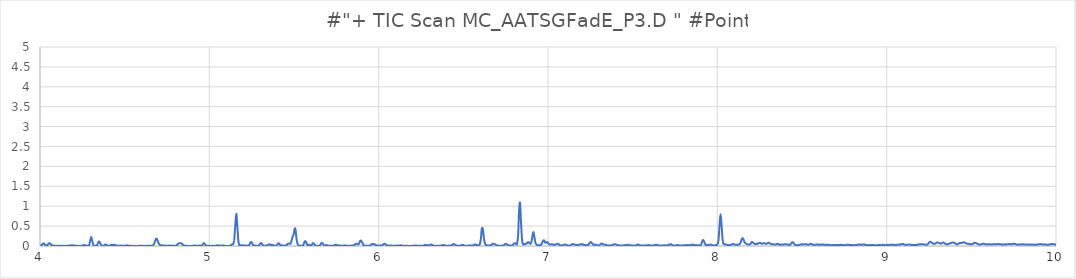
| Category | Series 0 |
|---|---|
| 3.393 | 0.011 |
| 3.399 | 0.013 |
| 3.405 | 0.021 |
| 3.411 | 0.059 |
| 3.416 | 0.067 |
| 3.422 | 0.036 |
| 3.428 | 0.018 |
| 3.434 | 0.018 |
| 3.44 | 0.01 |
| 3.446 | 0.005 |
| 3.452 | 0.004 |
| 3.458 | 0.003 |
| 3.464 | 0.005 |
| 3.47 | 0.005 |
| 3.476 | 0.008 |
| 3.482 | 0.01 |
| 3.488 | 0.01 |
| 3.494 | 0.007 |
| 3.5 | 0.006 |
| 3.506 | 0.006 |
| 3.512 | 0.01 |
| 3.518 | 0.007 |
| 3.524 | 0.008 |
| 3.529 | 0.006 |
| 3.535 | 0.007 |
| 3.541 | 0.004 |
| 3.547 | 0.006 |
| 3.553 | 0.004 |
| 3.559 | 0.009 |
| 3.565 | 0.006 |
| 3.571 | 0.005 |
| 3.577 | 0.002 |
| 3.583 | 0.005 |
| 3.589 | 0.007 |
| 3.595 | 0.007 |
| 3.601 | 0.004 |
| 3.607 | 0.007 |
| 3.613 | 0.006 |
| 3.619 | 0.013 |
| 3.625 | 0.032 |
| 3.631 | 0.049 |
| 3.636 | 0.143 |
| 3.642 | 0.401 |
| 3.648 | 0.504 |
| 3.654 | 0.333 |
| 3.66 | 0.154 |
| 3.666 | 0.046 |
| 3.672 | 0.014 |
| 3.678 | 0.01 |
| 3.684 | 0.014 |
| 3.69 | 0.047 |
| 3.696 | 0.091 |
| 3.702 | 0.074 |
| 3.708 | 0.029 |
| 3.714 | 0.033 |
| 3.72 | 0.135 |
| 3.726 | 0.275 |
| 3.732 | 0.215 |
| 3.738 | 0.069 |
| 3.744 | 0.017 |
| 3.749 | 0.01 |
| 3.755 | 0.008 |
| 3.761 | 0.01 |
| 3.767 | 0.015 |
| 3.773 | 0.016 |
| 3.779 | 0.009 |
| 3.785 | 0.003 |
| 3.791 | 0.006 |
| 3.797 | 0.004 |
| 3.803 | 0.002 |
| 3.809 | 0.007 |
| 3.815 | 0.006 |
| 3.821 | 0.008 |
| 3.827 | 0.003 |
| 3.833 | 0.006 |
| 3.839 | 0.004 |
| 3.845 | 0.007 |
| 3.851 | 0.004 |
| 3.856 | 0.005 |
| 3.862 | 0.007 |
| 3.868 | 0.019 |
| 3.874 | 0.043 |
| 3.88 | 0.038 |
| 3.886 | 0.03 |
| 3.892 | 0.033 |
| 3.898 | 0.044 |
| 3.904 | 0.142 |
| 3.91 | 0.493 |
| 3.916 | 0.667 |
| 3.922 | 0.336 |
| 3.928 | 0.072 |
| 3.934 | 0.021 |
| 3.94 | 0.036 |
| 3.946 | 0.165 |
| 3.952 | 0.282 |
| 3.958 | 0.194 |
| 3.964 | 0.079 |
| 3.969 | 0.058 |
| 3.975 | 0.09 |
| 3.981 | 0.116 |
| 3.987 | 0.086 |
| 3.993 | 0.049 |
| 3.999 | 0.026 |
| 4.005 | 0.015 |
| 4.011 | 0.03 |
| 4.017 | 0.061 |
| 4.023 | 0.062 |
| 4.029 | 0.034 |
| 4.035 | 0.01 |
| 4.041 | 0.015 |
| 4.047 | 0.041 |
| 4.053 | 0.069 |
| 4.059 | 0.064 |
| 4.065 | 0.034 |
| 4.071 | 0.028 |
| 4.076 | 0.015 |
| 4.082 | 0.007 |
| 4.088 | 0.008 |
| 4.094 | 0.001 |
| 4.1 | 0.005 |
| 4.106 | 0.006 |
| 4.112 | 0.004 |
| 4.118 | 0.004 |
| 4.124 | 0.009 |
| 4.13 | 0.002 |
| 4.136 | 0.005 |
| 4.142 | 0.002 |
| 4.148 | 0.003 |
| 4.154 | 0.007 |
| 4.16 | 0.004 |
| 4.166 | 0.004 |
| 4.172 | 0.007 |
| 4.178 | 0.013 |
| 4.184 | 0.018 |
| 4.189 | 0.018 |
| 4.195 | 0.016 |
| 4.201 | 0.009 |
| 4.207 | 0.012 |
| 4.213 | 0.003 |
| 4.219 | 0.006 |
| 4.225 | 0.003 |
| 4.231 | 0.002 |
| 4.237 | 0.003 |
| 4.243 | 0.003 |
| 4.249 | 0.006 |
| 4.255 | 0.02 |
| 4.261 | 0.027 |
| 4.267 | 0.019 |
| 4.273 | 0.011 |
| 4.279 | 0.007 |
| 4.285 | 0.006 |
| 4.291 | 0.036 |
| 4.296 | 0.121 |
| 4.302 | 0.225 |
| 4.308 | 0.141 |
| 4.314 | 0.043 |
| 4.32 | 0.01 |
| 4.326 | 0.003 |
| 4.332 | 0.006 |
| 4.338 | 0.029 |
| 4.344 | 0.088 |
| 4.35 | 0.116 |
| 4.356 | 0.069 |
| 4.362 | 0.021 |
| 4.368 | 0.005 |
| 4.374 | 0.006 |
| 4.38 | 0.017 |
| 4.386 | 0.037 |
| 4.392 | 0.033 |
| 4.398 | 0.014 |
| 4.404 | 0.008 |
| 4.409 | 0.008 |
| 4.415 | 0.018 |
| 4.421 | 0.027 |
| 4.427 | 0.025 |
| 4.433 | 0.024 |
| 4.439 | 0.032 |
| 4.445 | 0.025 |
| 4.451 | 0.013 |
| 4.457 | 0.004 |
| 4.463 | 0.004 |
| 4.469 | 0.009 |
| 4.475 | 0.011 |
| 4.481 | 0.006 |
| 4.487 | 0.01 |
| 4.493 | 0.004 |
| 4.499 | 0.005 |
| 4.505 | 0.009 |
| 4.511 | 0.017 |
| 4.516 | 0.013 |
| 4.522 | 0.011 |
| 4.528 | 0.006 |
| 4.534 | 0.006 |
| 4.54 | 0.003 |
| 4.546 | 0.004 |
| 4.552 | 0.002 |
| 4.558 | 0.001 |
| 4.564 | 0.004 |
| 4.57 | 0.001 |
| 4.576 | 0.002 |
| 4.582 | 0.006 |
| 4.588 | 0.007 |
| 4.594 | 0.004 |
| 4.6 | 0.005 |
| 4.606 | 0.004 |
| 4.612 | 0.003 |
| 4.618 | 0.002 |
| 4.624 | 0.003 |
| 4.629 | 0.003 |
| 4.635 | 0.004 |
| 4.641 | 0.003 |
| 4.647 | 0.007 |
| 4.653 | 0.005 |
| 4.659 | 0.006 |
| 4.665 | 0.012 |
| 4.671 | 0.034 |
| 4.677 | 0.092 |
| 4.683 | 0.167 |
| 4.689 | 0.187 |
| 4.695 | 0.131 |
| 4.701 | 0.066 |
| 4.707 | 0.034 |
| 4.713 | 0.02 |
| 4.719 | 0.014 |
| 4.725 | 0.012 |
| 4.731 | 0.012 |
| 4.736 | 0.01 |
| 4.742 | 0.007 |
| 4.748 | 0.007 |
| 4.754 | 0.009 |
| 4.76 | 0.01 |
| 4.766 | 0.007 |
| 4.772 | 0.012 |
| 4.778 | 0.007 |
| 4.784 | 0.005 |
| 4.79 | 0.007 |
| 4.796 | 0.006 |
| 4.802 | 0.007 |
| 4.808 | 0.023 |
| 4.814 | 0.051 |
| 4.82 | 0.066 |
| 4.826 | 0.066 |
| 4.832 | 0.069 |
| 4.838 | 0.059 |
| 4.844 | 0.03 |
| 4.849 | 0.014 |
| 4.855 | 0.009 |
| 4.861 | 0.007 |
| 4.867 | 0.005 |
| 4.873 | 0 |
| 4.879 | 0.002 |
| 4.885 | 0 |
| 4.891 | 0.003 |
| 4.897 | 0 |
| 4.903 | 0.007 |
| 4.909 | 0.011 |
| 4.915 | 0.01 |
| 4.921 | 0.003 |
| 4.927 | 0.006 |
| 4.933 | 0.007 |
| 4.939 | 0.009 |
| 4.945 | 0.012 |
| 4.951 | 0.009 |
| 4.956 | 0.012 |
| 4.962 | 0.046 |
| 4.968 | 0.073 |
| 4.974 | 0.044 |
| 4.98 | 0.014 |
| 4.986 | 0.007 |
| 4.992 | 0.004 |
| 4.998 | 0.005 |
| 5.004 | 0.003 |
| 5.01 | 0.002 |
| 5.016 | 0.003 |
| 5.022 | 0.006 |
| 5.028 | 0.007 |
| 5.034 | 0.006 |
| 5.04 | 0.009 |
| 5.046 | 0.011 |
| 5.052 | 0.02 |
| 5.058 | 0.011 |
| 5.064 | 0.005 |
| 5.069 | 0.008 |
| 5.075 | 0.011 |
| 5.081 | 0.013 |
| 5.087 | 0.01 |
| 5.093 | 0.006 |
| 5.099 | 0.003 |
| 5.105 | 0.002 |
| 5.111 | 0.002 |
| 5.117 | 0.003 |
| 5.123 | 0.009 |
| 5.129 | 0.024 |
| 5.135 | 0.044 |
| 5.141 | 0.046 |
| 5.147 | 0.137 |
| 5.153 | 0.512 |
| 5.159 | 0.813 |
| 5.165 | 0.522 |
| 5.171 | 0.146 |
| 5.176 | 0.032 |
| 5.182 | 0.018 |
| 5.188 | 0.016 |
| 5.194 | 0.012 |
| 5.2 | 0.015 |
| 5.206 | 0.016 |
| 5.212 | 0.01 |
| 5.218 | 0.01 |
| 5.224 | 0.006 |
| 5.23 | 0.007 |
| 5.236 | 0.031 |
| 5.242 | 0.082 |
| 5.248 | 0.099 |
| 5.254 | 0.057 |
| 5.26 | 0.017 |
| 5.266 | 0.014 |
| 5.272 | 0.01 |
| 5.278 | 0.006 |
| 5.284 | 0.005 |
| 5.289 | 0.006 |
| 5.295 | 0.025 |
| 5.301 | 0.06 |
| 5.307 | 0.076 |
| 5.313 | 0.04 |
| 5.319 | 0.011 |
| 5.325 | 0.008 |
| 5.331 | 0.009 |
| 5.337 | 0.01 |
| 5.343 | 0.02 |
| 5.349 | 0.033 |
| 5.355 | 0.043 |
| 5.361 | 0.03 |
| 5.367 | 0.022 |
| 5.373 | 0.026 |
| 5.379 | 0.017 |
| 5.385 | 0.009 |
| 5.391 | 0.007 |
| 5.396 | 0.014 |
| 5.402 | 0.043 |
| 5.408 | 0.07 |
| 5.414 | 0.052 |
| 5.42 | 0.021 |
| 5.426 | 0.015 |
| 5.432 | 0.015 |
| 5.438 | 0.012 |
| 5.444 | 0.009 |
| 5.45 | 0.009 |
| 5.456 | 0.023 |
| 5.462 | 0.049 |
| 5.468 | 0.064 |
| 5.474 | 0.056 |
| 5.48 | 0.062 |
| 5.486 | 0.145 |
| 5.492 | 0.234 |
| 5.498 | 0.291 |
| 5.504 | 0.434 |
| 5.509 | 0.409 |
| 5.515 | 0.181 |
| 5.521 | 0.056 |
| 5.527 | 0.016 |
| 5.533 | 0.008 |
| 5.539 | 0.005 |
| 5.545 | 0.005 |
| 5.551 | 0.01 |
| 5.557 | 0.043 |
| 5.563 | 0.112 |
| 5.569 | 0.117 |
| 5.575 | 0.059 |
| 5.581 | 0.021 |
| 5.587 | 0.03 |
| 5.593 | 0.024 |
| 5.599 | 0.019 |
| 5.605 | 0.029 |
| 5.611 | 0.067 |
| 5.616 | 0.066 |
| 5.622 | 0.035 |
| 5.628 | 0.009 |
| 5.634 | 0.003 |
| 5.64 | 0.003 |
| 5.646 | 0.003 |
| 5.652 | 0.016 |
| 5.658 | 0.046 |
| 5.664 | 0.08 |
| 5.67 | 0.064 |
| 5.676 | 0.023 |
| 5.682 | 0.013 |
| 5.688 | 0.019 |
| 5.694 | 0.023 |
| 5.7 | 0.01 |
| 5.706 | 0.006 |
| 5.712 | 0.006 |
| 5.718 | 0.003 |
| 5.724 | 0.004 |
| 5.729 | 0.008 |
| 5.735 | 0.006 |
| 5.741 | 0.025 |
| 5.747 | 0.034 |
| 5.753 | 0.024 |
| 5.759 | 0.019 |
| 5.765 | 0.013 |
| 5.771 | 0.012 |
| 5.777 | 0.006 |
| 5.783 | 0.006 |
| 5.789 | 0.004 |
| 5.795 | 0.015 |
| 5.801 | 0.016 |
| 5.807 | 0.01 |
| 5.813 | 0.007 |
| 5.819 | 0.007 |
| 5.825 | 0.008 |
| 5.831 | 0.007 |
| 5.836 | 0.01 |
| 5.842 | 0.006 |
| 5.848 | 0.013 |
| 5.854 | 0.019 |
| 5.86 | 0.034 |
| 5.866 | 0.056 |
| 5.872 | 0.056 |
| 5.878 | 0.041 |
| 5.884 | 0.057 |
| 5.89 | 0.124 |
| 5.896 | 0.134 |
| 5.902 | 0.095 |
| 5.908 | 0.044 |
| 5.914 | 0.015 |
| 5.92 | 0.006 |
| 5.926 | 0.004 |
| 5.932 | 0.006 |
| 5.938 | 0.006 |
| 5.944 | 0.009 |
| 5.949 | 0.011 |
| 5.955 | 0.032 |
| 5.961 | 0.051 |
| 5.967 | 0.05 |
| 5.973 | 0.044 |
| 5.979 | 0.035 |
| 5.985 | 0.024 |
| 5.991 | 0.011 |
| 5.997 | 0.008 |
| 6.003 | 0.013 |
| 6.009 | 0.013 |
| 6.015 | 0.012 |
| 6.021 | 0.023 |
| 6.027 | 0.04 |
| 6.033 | 0.055 |
| 6.039 | 0.049 |
| 6.045 | 0.027 |
| 6.051 | 0.013 |
| 6.056 | 0.011 |
| 6.062 | 0.012 |
| 6.068 | 0.012 |
| 6.074 | 0.012 |
| 6.08 | 0.005 |
| 6.086 | 0.004 |
| 6.092 | 0.01 |
| 6.098 | 0.008 |
| 6.104 | 0.01 |
| 6.11 | 0.009 |
| 6.116 | 0.009 |
| 6.122 | 0.015 |
| 6.128 | 0.018 |
| 6.134 | 0.012 |
| 6.14 | 0.006 |
| 6.146 | 0.006 |
| 6.152 | 0.005 |
| 6.158 | 0.008 |
| 6.164 | 0.007 |
| 6.169 | 0.005 |
| 6.175 | 0.003 |
| 6.181 | 0.002 |
| 6.187 | 0.003 |
| 6.193 | 0.002 |
| 6.199 | 0.006 |
| 6.205 | 0.009 |
| 6.211 | 0.009 |
| 6.217 | 0.014 |
| 6.223 | 0.009 |
| 6.229 | 0.007 |
| 6.235 | 0.003 |
| 6.241 | 0.005 |
| 6.247 | 0.006 |
| 6.253 | 0.007 |
| 6.259 | 0.005 |
| 6.265 | 0.013 |
| 6.271 | 0.021 |
| 6.276 | 0.025 |
| 6.282 | 0.025 |
| 6.288 | 0.02 |
| 6.294 | 0.013 |
| 6.3 | 0.018 |
| 6.306 | 0.035 |
| 6.312 | 0.036 |
| 6.318 | 0.022 |
| 6.324 | 0.01 |
| 6.33 | 0.007 |
| 6.336 | 0.006 |
| 6.342 | 0.004 |
| 6.348 | 0.005 |
| 6.354 | 0.004 |
| 6.36 | 0.004 |
| 6.366 | 0.007 |
| 6.372 | 0.012 |
| 6.378 | 0.023 |
| 6.384 | 0.026 |
| 6.389 | 0.018 |
| 6.395 | 0.012 |
| 6.401 | 0.006 |
| 6.407 | 0.002 |
| 6.413 | 0.005 |
| 6.419 | 0.011 |
| 6.425 | 0.014 |
| 6.431 | 0.014 |
| 6.437 | 0.039 |
| 6.443 | 0.049 |
| 6.449 | 0.037 |
| 6.455 | 0.016 |
| 6.461 | 0.013 |
| 6.467 | 0.006 |
| 6.473 | 0.007 |
| 6.479 | 0.006 |
| 6.485 | 0.013 |
| 6.491 | 0.025 |
| 6.496 | 0.027 |
| 6.502 | 0.017 |
| 6.508 | 0.01 |
| 6.514 | 0.007 |
| 6.52 | 0.004 |
| 6.526 | 0.006 |
| 6.532 | 0.01 |
| 6.538 | 0.017 |
| 6.544 | 0.015 |
| 6.55 | 0.008 |
| 6.556 | 0.009 |
| 6.562 | 0.025 |
| 6.568 | 0.035 |
| 6.574 | 0.038 |
| 6.58 | 0.02 |
| 6.586 | 0.016 |
| 6.592 | 0.023 |
| 6.598 | 0.053 |
| 6.604 | 0.204 |
| 6.609 | 0.434 |
| 6.615 | 0.434 |
| 6.621 | 0.218 |
| 6.627 | 0.073 |
| 6.633 | 0.029 |
| 6.639 | 0.014 |
| 6.645 | 0.011 |
| 6.651 | 0.013 |
| 6.657 | 0.016 |
| 6.663 | 0.018 |
| 6.669 | 0.034 |
| 6.675 | 0.059 |
| 6.681 | 0.054 |
| 6.687 | 0.042 |
| 6.693 | 0.029 |
| 6.699 | 0.015 |
| 6.705 | 0.009 |
| 6.711 | 0.005 |
| 6.716 | 0.005 |
| 6.722 | 0.008 |
| 6.728 | 0.008 |
| 6.734 | 0.008 |
| 6.74 | 0.025 |
| 6.746 | 0.046 |
| 6.752 | 0.055 |
| 6.758 | 0.038 |
| 6.764 | 0.02 |
| 6.77 | 0.012 |
| 6.776 | 0.012 |
| 6.782 | 0.01 |
| 6.788 | 0.013 |
| 6.794 | 0.034 |
| 6.8 | 0.063 |
| 6.806 | 0.071 |
| 6.812 | 0.047 |
| 6.818 | 0.061 |
| 6.824 | 0.304 |
| 6.829 | 0.872 |
| 6.835 | 1.083 |
| 6.841 | 0.566 |
| 6.847 | 0.147 |
| 6.853 | 0.044 |
| 6.859 | 0.043 |
| 6.865 | 0.049 |
| 6.871 | 0.054 |
| 6.877 | 0.076 |
| 6.883 | 0.099 |
| 6.889 | 0.079 |
| 6.895 | 0.053 |
| 6.901 | 0.085 |
| 6.907 | 0.223 |
| 6.913 | 0.35 |
| 6.919 | 0.24 |
| 6.925 | 0.097 |
| 6.931 | 0.042 |
| 6.936 | 0.024 |
| 6.942 | 0.02 |
| 6.948 | 0.022 |
| 6.954 | 0.021 |
| 6.96 | 0.039 |
| 6.966 | 0.083 |
| 6.972 | 0.137 |
| 6.978 | 0.137 |
| 6.984 | 0.083 |
| 6.99 | 0.093 |
| 6.996 | 0.098 |
| 7.002 | 0.064 |
| 7.008 | 0.043 |
| 7.014 | 0.038 |
| 7.02 | 0.045 |
| 7.026 | 0.039 |
| 7.032 | 0.035 |
| 7.038 | 0.025 |
| 7.044 | 0.038 |
| 7.049 | 0.044 |
| 7.055 | 0.054 |
| 7.061 | 0.05 |
| 7.067 | 0.029 |
| 7.073 | 0.017 |
| 7.079 | 0.01 |
| 7.085 | 0.015 |
| 7.091 | 0.029 |
| 7.097 | 0.035 |
| 7.103 | 0.035 |
| 7.109 | 0.027 |
| 7.115 | 0.016 |
| 7.121 | 0.013 |
| 7.127 | 0.008 |
| 7.133 | 0.014 |
| 7.139 | 0.038 |
| 7.145 | 0.048 |
| 7.151 | 0.042 |
| 7.156 | 0.038 |
| 7.162 | 0.032 |
| 7.168 | 0.027 |
| 7.174 | 0.024 |
| 7.18 | 0.03 |
| 7.186 | 0.037 |
| 7.192 | 0.038 |
| 7.198 | 0.045 |
| 7.204 | 0.045 |
| 7.21 | 0.036 |
| 7.216 | 0.02 |
| 7.222 | 0.018 |
| 7.228 | 0.024 |
| 7.234 | 0.031 |
| 7.24 | 0.036 |
| 7.246 | 0.078 |
| 7.252 | 0.099 |
| 7.258 | 0.081 |
| 7.264 | 0.049 |
| 7.269 | 0.029 |
| 7.275 | 0.034 |
| 7.281 | 0.036 |
| 7.287 | 0.026 |
| 7.293 | 0.014 |
| 7.299 | 0.011 |
| 7.305 | 0.02 |
| 7.311 | 0.05 |
| 7.317 | 0.061 |
| 7.323 | 0.047 |
| 7.329 | 0.037 |
| 7.335 | 0.039 |
| 7.341 | 0.032 |
| 7.347 | 0.018 |
| 7.353 | 0.013 |
| 7.359 | 0.015 |
| 7.365 | 0.012 |
| 7.371 | 0.013 |
| 7.376 | 0.017 |
| 7.382 | 0.029 |
| 7.388 | 0.039 |
| 7.394 | 0.043 |
| 7.4 | 0.04 |
| 7.406 | 0.027 |
| 7.412 | 0.018 |
| 7.418 | 0.02 |
| 7.424 | 0.014 |
| 7.43 | 0.007 |
| 7.436 | 0.011 |
| 7.442 | 0.012 |
| 7.448 | 0.018 |
| 7.454 | 0.019 |
| 7.46 | 0.023 |
| 7.466 | 0.028 |
| 7.472 | 0.031 |
| 7.478 | 0.023 |
| 7.484 | 0.017 |
| 7.489 | 0.015 |
| 7.495 | 0.013 |
| 7.501 | 0.012 |
| 7.507 | 0.011 |
| 7.513 | 0.01 |
| 7.519 | 0.015 |
| 7.525 | 0.03 |
| 7.531 | 0.037 |
| 7.537 | 0.03 |
| 7.543 | 0.017 |
| 7.549 | 0.011 |
| 7.555 | 0.01 |
| 7.561 | 0.012 |
| 7.567 | 0.013 |
| 7.573 | 0.014 |
| 7.579 | 0.016 |
| 7.585 | 0.02 |
| 7.591 | 0.021 |
| 7.596 | 0.024 |
| 7.602 | 0.018 |
| 7.608 | 0.013 |
| 7.614 | 0.016 |
| 7.62 | 0.014 |
| 7.626 | 0.018 |
| 7.632 | 0.029 |
| 7.638 | 0.031 |
| 7.644 | 0.027 |
| 7.65 | 0.017 |
| 7.656 | 0.014 |
| 7.662 | 0.013 |
| 7.668 | 0.013 |
| 7.674 | 0.012 |
| 7.68 | 0.014 |
| 7.686 | 0.018 |
| 7.692 | 0.015 |
| 7.698 | 0.01 |
| 7.704 | 0.016 |
| 7.709 | 0.017 |
| 7.715 | 0.033 |
| 7.721 | 0.043 |
| 7.727 | 0.044 |
| 7.733 | 0.025 |
| 7.739 | 0.016 |
| 7.745 | 0.014 |
| 7.751 | 0.013 |
| 7.757 | 0.017 |
| 7.763 | 0.02 |
| 7.769 | 0.027 |
| 7.775 | 0.012 |
| 7.781 | 0.013 |
| 7.787 | 0.015 |
| 7.793 | 0.014 |
| 7.799 | 0.013 |
| 7.805 | 0.022 |
| 7.811 | 0.021 |
| 7.816 | 0.021 |
| 7.822 | 0.023 |
| 7.828 | 0.018 |
| 7.834 | 0.021 |
| 7.84 | 0.024 |
| 7.846 | 0.026 |
| 7.852 | 0.033 |
| 7.858 | 0.034 |
| 7.864 | 0.025 |
| 7.87 | 0.019 |
| 7.876 | 0.016 |
| 7.882 | 0.019 |
| 7.888 | 0.019 |
| 7.894 | 0.017 |
| 7.9 | 0.017 |
| 7.906 | 0.055 |
| 7.912 | 0.129 |
| 7.918 | 0.147 |
| 7.924 | 0.088 |
| 7.929 | 0.039 |
| 7.935 | 0.026 |
| 7.941 | 0.024 |
| 7.947 | 0.023 |
| 7.953 | 0.031 |
| 7.959 | 0.036 |
| 7.965 | 0.034 |
| 7.971 | 0.019 |
| 7.977 | 0.011 |
| 7.983 | 0.014 |
| 7.989 | 0.017 |
| 7.995 | 0.028 |
| 8.001 | 0.044 |
| 8.007 | 0.15 |
| 8.013 | 0.522 |
| 8.019 | 0.801 |
| 8.025 | 0.524 |
| 8.031 | 0.165 |
| 8.036 | 0.057 |
| 8.042 | 0.043 |
| 8.048 | 0.041 |
| 8.054 | 0.033 |
| 8.06 | 0.027 |
| 8.066 | 0.024 |
| 8.072 | 0.02 |
| 8.078 | 0.026 |
| 8.084 | 0.035 |
| 8.09 | 0.05 |
| 8.096 | 0.046 |
| 8.102 | 0.038 |
| 8.108 | 0.03 |
| 8.114 | 0.034 |
| 8.12 | 0.03 |
| 8.126 | 0.034 |
| 8.132 | 0.052 |
| 8.138 | 0.093 |
| 8.144 | 0.165 |
| 8.149 | 0.2 |
| 8.155 | 0.163 |
| 8.161 | 0.094 |
| 8.167 | 0.065 |
| 8.173 | 0.054 |
| 8.179 | 0.04 |
| 8.185 | 0.039 |
| 8.191 | 0.038 |
| 8.197 | 0.059 |
| 8.203 | 0.099 |
| 8.209 | 0.096 |
| 8.215 | 0.068 |
| 8.221 | 0.051 |
| 8.227 | 0.044 |
| 8.233 | 0.061 |
| 8.239 | 0.057 |
| 8.245 | 0.07 |
| 8.251 | 0.079 |
| 8.256 | 0.075 |
| 8.262 | 0.058 |
| 8.268 | 0.058 |
| 8.274 | 0.07 |
| 8.28 | 0.07 |
| 8.286 | 0.055 |
| 8.292 | 0.057 |
| 8.298 | 0.072 |
| 8.304 | 0.082 |
| 8.31 | 0.064 |
| 8.316 | 0.055 |
| 8.322 | 0.043 |
| 8.328 | 0.043 |
| 8.334 | 0.041 |
| 8.34 | 0.039 |
| 8.346 | 0.035 |
| 8.352 | 0.049 |
| 8.358 | 0.053 |
| 8.364 | 0.044 |
| 8.369 | 0.027 |
| 8.375 | 0.034 |
| 8.381 | 0.039 |
| 8.387 | 0.038 |
| 8.393 | 0.039 |
| 8.399 | 0.045 |
| 8.405 | 0.043 |
| 8.411 | 0.04 |
| 8.417 | 0.033 |
| 8.423 | 0.03 |
| 8.429 | 0.028 |
| 8.435 | 0.056 |
| 8.441 | 0.091 |
| 8.447 | 0.09 |
| 8.453 | 0.056 |
| 8.459 | 0.028 |
| 8.465 | 0.02 |
| 8.471 | 0.019 |
| 8.476 | 0.018 |
| 8.482 | 0.031 |
| 8.488 | 0.034 |
| 8.494 | 0.041 |
| 8.5 | 0.043 |
| 8.506 | 0.036 |
| 8.512 | 0.037 |
| 8.518 | 0.048 |
| 8.524 | 0.045 |
| 8.53 | 0.036 |
| 8.536 | 0.03 |
| 8.542 | 0.036 |
| 8.548 | 0.052 |
| 8.554 | 0.054 |
| 8.56 | 0.038 |
| 8.566 | 0.029 |
| 8.572 | 0.029 |
| 8.578 | 0.028 |
| 8.584 | 0.035 |
| 8.589 | 0.041 |
| 8.595 | 0.038 |
| 8.601 | 0.03 |
| 8.607 | 0.036 |
| 8.613 | 0.032 |
| 8.619 | 0.04 |
| 8.625 | 0.034 |
| 8.631 | 0.033 |
| 8.637 | 0.027 |
| 8.643 | 0.03 |
| 8.649 | 0.031 |
| 8.655 | 0.029 |
| 8.661 | 0.029 |
| 8.667 | 0.023 |
| 8.673 | 0.021 |
| 8.679 | 0.022 |
| 8.685 | 0.021 |
| 8.691 | 0.025 |
| 8.696 | 0.027 |
| 8.702 | 0.025 |
| 8.708 | 0.027 |
| 8.714 | 0.028 |
| 8.72 | 0.027 |
| 8.726 | 0.029 |
| 8.732 | 0.026 |
| 8.738 | 0.024 |
| 8.744 | 0.022 |
| 8.75 | 0.02 |
| 8.756 | 0.024 |
| 8.762 | 0.032 |
| 8.768 | 0.03 |
| 8.774 | 0.029 |
| 8.78 | 0.027 |
| 8.786 | 0.024 |
| 8.792 | 0.025 |
| 8.798 | 0.023 |
| 8.804 | 0.017 |
| 8.809 | 0.02 |
| 8.815 | 0.026 |
| 8.821 | 0.026 |
| 8.827 | 0.03 |
| 8.833 | 0.034 |
| 8.839 | 0.039 |
| 8.845 | 0.032 |
| 8.851 | 0.032 |
| 8.857 | 0.037 |
| 8.863 | 0.038 |
| 8.869 | 0.039 |
| 8.875 | 0.028 |
| 8.881 | 0.025 |
| 8.887 | 0.021 |
| 8.893 | 0.024 |
| 8.899 | 0.021 |
| 8.905 | 0.022 |
| 8.911 | 0.023 |
| 8.916 | 0.022 |
| 8.922 | 0.023 |
| 8.928 | 0.02 |
| 8.934 | 0.019 |
| 8.94 | 0.021 |
| 8.946 | 0.022 |
| 8.952 | 0.029 |
| 8.958 | 0.027 |
| 8.964 | 0.027 |
| 8.97 | 0.029 |
| 8.976 | 0.032 |
| 8.982 | 0.024 |
| 8.988 | 0.023 |
| 8.994 | 0.018 |
| 9.0 | 0.023 |
| 9.006 | 0.03 |
| 9.012 | 0.026 |
| 9.018 | 0.03 |
| 9.024 | 0.033 |
| 9.029 | 0.033 |
| 9.035 | 0.029 |
| 9.041 | 0.029 |
| 9.047 | 0.024 |
| 9.053 | 0.027 |
| 9.059 | 0.028 |
| 9.065 | 0.036 |
| 9.071 | 0.034 |
| 9.077 | 0.036 |
| 9.083 | 0.041 |
| 9.089 | 0.049 |
| 9.095 | 0.051 |
| 9.101 | 0.042 |
| 9.107 | 0.03 |
| 9.113 | 0.035 |
| 9.119 | 0.03 |
| 9.125 | 0.033 |
| 9.131 | 0.039 |
| 9.137 | 0.037 |
| 9.142 | 0.032 |
| 9.148 | 0.025 |
| 9.154 | 0.027 |
| 9.16 | 0.029 |
| 9.166 | 0.024 |
| 9.172 | 0.027 |
| 9.178 | 0.027 |
| 9.184 | 0.032 |
| 9.19 | 0.043 |
| 9.196 | 0.043 |
| 9.202 | 0.044 |
| 9.208 | 0.045 |
| 9.214 | 0.043 |
| 9.22 | 0.04 |
| 9.226 | 0.035 |
| 9.232 | 0.032 |
| 9.238 | 0.034 |
| 9.244 | 0.05 |
| 9.249 | 0.083 |
| 9.255 | 0.106 |
| 9.261 | 0.099 |
| 9.267 | 0.081 |
| 9.273 | 0.064 |
| 9.279 | 0.053 |
| 9.285 | 0.059 |
| 9.291 | 0.068 |
| 9.297 | 0.09 |
| 9.303 | 0.086 |
| 9.309 | 0.077 |
| 9.315 | 0.069 |
| 9.321 | 0.055 |
| 9.327 | 0.076 |
| 9.333 | 0.088 |
| 9.339 | 0.079 |
| 9.345 | 0.059 |
| 9.351 | 0.05 |
| 9.357 | 0.04 |
| 9.362 | 0.045 |
| 9.368 | 0.06 |
| 9.374 | 0.065 |
| 9.38 | 0.072 |
| 9.386 | 0.085 |
| 9.392 | 0.09 |
| 9.398 | 0.082 |
| 9.404 | 0.069 |
| 9.41 | 0.048 |
| 9.416 | 0.043 |
| 9.422 | 0.052 |
| 9.428 | 0.069 |
| 9.434 | 0.079 |
| 9.44 | 0.074 |
| 9.446 | 0.081 |
| 9.452 | 0.092 |
| 9.458 | 0.09 |
| 9.464 | 0.08 |
| 9.469 | 0.069 |
| 9.475 | 0.058 |
| 9.481 | 0.057 |
| 9.487 | 0.05 |
| 9.493 | 0.045 |
| 9.499 | 0.041 |
| 9.505 | 0.051 |
| 9.511 | 0.056 |
| 9.517 | 0.078 |
| 9.523 | 0.077 |
| 9.529 | 0.071 |
| 9.535 | 0.055 |
| 9.541 | 0.044 |
| 9.547 | 0.039 |
| 9.553 | 0.038 |
| 9.559 | 0.044 |
| 9.565 | 0.052 |
| 9.571 | 0.056 |
| 9.577 | 0.052 |
| 9.582 | 0.047 |
| 9.588 | 0.044 |
| 9.594 | 0.039 |
| 9.6 | 0.044 |
| 9.606 | 0.044 |
| 9.612 | 0.04 |
| 9.618 | 0.04 |
| 9.624 | 0.044 |
| 9.63 | 0.043 |
| 9.636 | 0.045 |
| 9.642 | 0.047 |
| 9.648 | 0.045 |
| 9.654 | 0.049 |
| 9.66 | 0.049 |
| 9.666 | 0.045 |
| 9.672 | 0.045 |
| 9.678 | 0.038 |
| 9.684 | 0.034 |
| 9.689 | 0.038 |
| 9.695 | 0.043 |
| 9.701 | 0.038 |
| 9.707 | 0.045 |
| 9.713 | 0.042 |
| 9.719 | 0.048 |
| 9.725 | 0.053 |
| 9.731 | 0.045 |
| 9.737 | 0.042 |
| 9.743 | 0.052 |
| 9.749 | 0.056 |
| 9.755 | 0.057 |
| 9.761 | 0.047 |
| 9.767 | 0.039 |
| 9.773 | 0.034 |
| 9.779 | 0.035 |
| 9.785 | 0.036 |
| 9.791 | 0.035 |
| 9.797 | 0.039 |
| 9.802 | 0.046 |
| 9.808 | 0.043 |
| 9.814 | 0.036 |
| 9.82 | 0.04 |
| 9.826 | 0.035 |
| 9.832 | 0.035 |
| 9.838 | 0.037 |
| 9.844 | 0.04 |
| 9.85 | 0.034 |
| 9.856 | 0.035 |
| 9.862 | 0.039 |
| 9.868 | 0.03 |
| 9.874 | 0.031 |
| 9.88 | 0.032 |
| 9.886 | 0.036 |
| 9.892 | 0.038 |
| 9.898 | 0.044 |
| 9.904 | 0.044 |
| 9.909 | 0.048 |
| 9.915 | 0.046 |
| 9.921 | 0.04 |
| 9.927 | 0.04 |
| 9.933 | 0.039 |
| 9.939 | 0.036 |
| 9.945 | 0.033 |
| 9.951 | 0.033 |
| 9.957 | 0.036 |
| 9.963 | 0.035 |
| 9.969 | 0.043 |
| 9.975 | 0.05 |
| 9.981 | 0.048 |
| 9.987 | 0.045 |
| 9.993 | 0.041 |
| 9.999 | 0.034 |
| 10.005 | 0.034 |
| 10.011 | 0.036 |
| 10.017 | 0.04 |
| 10.022 | 0.041 |
| 10.028 | 0.039 |
| 10.034 | 0.039 |
| 10.04 | 0.038 |
| 10.046 | 0.034 |
| 10.052 | 0.037 |
| 10.058 | 0.034 |
| 10.064 | 0.04 |
| 10.07 | 0.041 |
| 10.076 | 0.048 |
| 10.082 | 0.047 |
| 10.088 | 0.054 |
| 10.094 | 0.05 |
| 10.1 | 0.046 |
| 10.106 | 0.045 |
| 10.112 | 0.038 |
| 10.118 | 0.046 |
| 10.124 | 0.045 |
| 10.129 | 0.045 |
| 10.135 | 0.046 |
| 10.141 | 0.052 |
| 10.147 | 0.049 |
| 10.153 | 0.049 |
| 10.159 | 0.041 |
| 10.165 | 0.05 |
| 10.171 | 0.054 |
| 10.177 | 0.046 |
| 10.183 | 0.049 |
| 10.189 | 0.051 |
| 10.195 | 0.057 |
| 10.201 | 0.06 |
| 10.207 | 0.057 |
| 10.213 | 0.056 |
| 10.219 | 0.052 |
| 10.225 | 0.051 |
| 10.231 | 0.053 |
| 10.237 | 0.05 |
| 10.242 | 0.053 |
| 10.248 | 0.057 |
| 10.254 | 0.073 |
| 10.26 | 0.09 |
| 10.266 | 0.087 |
| 10.272 | 0.074 |
| 10.278 | 0.072 |
| 10.284 | 0.076 |
| 10.29 | 0.088 |
| 10.296 | 0.086 |
| 10.302 | 0.089 |
| 10.308 | 0.092 |
| 10.314 | 0.094 |
| 10.32 | 0.1 |
| 10.326 | 0.106 |
| 10.332 | 0.105 |
| 10.338 | 0.099 |
| 10.344 | 0.103 |
| 10.349 | 0.102 |
| 10.355 | 0.104 |
| 10.361 | 0.111 |
| 10.367 | 0.118 |
| 10.373 | 0.117 |
| 10.379 | 0.112 |
| 10.385 | 0.109 |
| 10.391 | 0.099 |
| 10.397 | 0.09 |
| 10.403 | 0.092 |
| 10.409 | 0.096 |
| 10.415 | 0.094 |
| 10.421 | 0.09 |
| 10.427 | 0.108 |
| 10.433 | 0.18 |
| 10.439 | 0.937 |
| 10.445 | 5.485 |
| 10.451 | 18.24 |
| 10.457 | 34.21 |
| 10.462 | 37.837 |
| 10.468 | 24.522 |
| 10.474 | 8.984 |
| 10.48 | 2.782 |
| 10.486 | 1.118 |
| 10.492 | 0.63 |
| 10.498 | 0.456 |
| 10.504 | 0.371 |
| 10.51 | 0.313 |
| 10.516 | 0.261 |
| 10.522 | 0.242 |
| 10.528 | 0.222 |
| 10.534 | 0.212 |
| 10.54 | 0.214 |
| 10.546 | 0.207 |
| 10.552 | 0.198 |
| 10.558 | 0.175 |
| 10.564 | 0.159 |
| 10.569 | 0.161 |
| 10.575 | 0.177 |
| 10.581 | 0.157 |
| 10.587 | 0.135 |
| 10.593 | 0.124 |
| 10.599 | 0.122 |
| 10.605 | 0.116 |
| 10.611 | 0.118 |
| 10.617 | 0.115 |
| 10.623 | 0.111 |
| 10.629 | 0.107 |
| 10.635 | 0.112 |
| 10.641 | 0.108 |
| 10.647 | 0.111 |
| 10.653 | 0.112 |
| 10.659 | 0.107 |
| 10.665 | 0.105 |
| 10.671 | 0.105 |
| 10.677 | 0.105 |
| 10.682 | 0.106 |
| 10.688 | 0.108 |
| 10.694 | 0.104 |
| 10.7 | 0.099 |
| 10.706 | 0.095 |
| 10.712 | 0.088 |
| 10.718 | 0.086 |
| 10.724 | 0.096 |
| 10.73 | 0.091 |
| 10.736 | 0.096 |
| 10.742 | 0.092 |
| 10.748 | 0.085 |
| 10.754 | 0.085 |
| 10.76 | 0.088 |
| 10.766 | 0.093 |
| 10.772 | 0.093 |
| 10.778 | 0.093 |
| 10.784 | 0.09 |
| 10.789 | 0.091 |
| 10.795 | 0.09 |
| 10.801 | 0.094 |
| 10.807 | 0.088 |
| 10.813 | 0.088 |
| 10.819 | 0.089 |
| 10.825 | 0.088 |
| 10.831 | 0.086 |
| 10.837 | 0.1 |
| 10.843 | 0.101 |
| 10.849 | 0.092 |
| 10.855 | 0.087 |
| 10.861 | 0.09 |
| 10.867 | 0.083 |
| 10.873 | 0.088 |
| 10.879 | 0.093 |
| 10.885 | 0.091 |
| 10.891 | 0.093 |
| 10.897 | 0.09 |
| 10.902 | 0.09 |
| 10.908 | 0.094 |
| 10.914 | 0.101 |
| 10.92 | 0.092 |
| 10.926 | 0.088 |
| 10.932 | 0.089 |
| 10.938 | 0.085 |
| 10.944 | 0.092 |
| 10.95 | 0.086 |
| 10.956 | 0.085 |
| 10.962 | 0.087 |
| 10.968 | 0.088 |
| 10.974 | 0.088 |
| 10.98 | 0.101 |
| 10.986 | 0.092 |
| 10.992 | 0.086 |
| 10.998 | 0.091 |
| 11.004 | 0.079 |
| 11.009 | 0.086 |
| 11.015 | 0.082 |
| 11.021 | 0.082 |
| 11.027 | 0.088 |
| 11.033 | 0.085 |
| 11.039 | 0.086 |
| 11.045 | 0.081 |
| 11.051 | 0.089 |
| 11.057 | 0.096 |
| 11.063 | 0.092 |
| 11.069 | 0.086 |
| 11.075 | 0.089 |
| 11.081 | 0.097 |
| 11.087 | 0.089 |
| 11.093 | 0.093 |
| 11.099 | 0.084 |
| 11.105 | 0.091 |
| 11.111 | 0.086 |
| 11.117 | 0.095 |
| 11.122 | 0.087 |
| 11.128 | 0.091 |
| 11.134 | 0.084 |
| 11.14 | 0.091 |
| 11.146 | 0.094 |
| 11.152 | 0.095 |
| 11.158 | 0.098 |
| 11.164 | 0.102 |
| 11.17 | 0.108 |
| 11.176 | 0.104 |
| 11.182 | 0.105 |
| 11.188 | 0.105 |
| 11.194 | 0.11 |
| 11.2 | 0.102 |
| 11.206 | 0.105 |
| 11.212 | 0.108 |
| 11.218 | 0.099 |
| 11.224 | 0.106 |
| 11.229 | 0.104 |
| 11.235 | 0.104 |
| 11.241 | 0.102 |
| 11.247 | 0.103 |
| 11.253 | 0.115 |
| 11.259 | 0.116 |
| 11.265 | 0.111 |
| 11.271 | 0.113 |
| 11.277 | 0.118 |
| 11.283 | 0.118 |
| 11.289 | 0.113 |
| 11.295 | 0.109 |
| 11.301 | 0.124 |
| 11.307 | 0.123 |
| 11.313 | 0.118 |
| 11.319 | 0.116 |
| 11.325 | 0.127 |
| 11.331 | 0.126 |
| 11.337 | 0.122 |
| 11.342 | 0.13 |
| 11.348 | 0.129 |
| 11.354 | 0.123 |
| 11.36 | 0.119 |
| 11.366 | 0.118 |
| 11.372 | 0.124 |
| 11.378 | 0.125 |
| 11.384 | 0.119 |
| 11.39 | 0.128 |
| 11.396 | 0.127 |
| 11.402 | 0.125 |
| 11.408 | 0.133 |
| 11.414 | 0.13 |
| 11.42 | 0.129 |
| 11.426 | 0.127 |
| 11.432 | 0.128 |
| 11.438 | 0.122 |
| 11.444 | 0.124 |
| 11.449 | 0.135 |
| 11.455 | 0.148 |
| 11.461 | 0.232 |
| 11.467 | 0.425 |
| 11.473 | 0.592 |
| 11.479 | 0.488 |
| 11.485 | 0.319 |
| 11.491 | 0.219 |
| 11.497 | 0.187 |
| 11.503 | 0.153 |
| 11.509 | 0.163 |
| 11.515 | 0.154 |
| 11.521 | 0.142 |
| 11.527 | 0.145 |
| 11.533 | 0.136 |
| 11.539 | 0.136 |
| 11.545 | 0.145 |
| 11.551 | 0.13 |
| 11.557 | 0.139 |
| 11.562 | 0.138 |
| 11.568 | 0.141 |
| 11.574 | 0.144 |
| 11.58 | 0.139 |
| 11.586 | 0.141 |
| 11.592 | 0.142 |
| 11.598 | 0.144 |
| 11.604 | 0.145 |
| 11.61 | 0.153 |
| 11.616 | 0.155 |
| 11.622 | 0.156 |
| 11.628 | 0.169 |
| 11.634 | 0.209 |
| 11.64 | 0.217 |
| 11.646 | 0.187 |
| 11.652 | 0.161 |
| 11.658 | 0.15 |
| 11.664 | 0.139 |
| 11.669 | 0.143 |
| 11.675 | 0.145 |
| 11.681 | 0.142 |
| 11.687 | 0.136 |
| 11.693 | 0.131 |
| 11.699 | 0.14 |
| 11.705 | 0.138 |
| 11.711 | 0.135 |
| 11.717 | 0.139 |
| 11.723 | 0.138 |
| 11.729 | 0.138 |
| 11.735 | 0.141 |
| 11.741 | 0.139 |
| 11.747 | 0.143 |
| 11.753 | 0.144 |
| 11.759 | 0.146 |
| 11.765 | 0.158 |
| 11.771 | 0.164 |
| 11.777 | 0.158 |
| 11.782 | 0.153 |
| 11.788 | 0.146 |
| 11.794 | 0.138 |
| 11.8 | 0.143 |
| 11.806 | 0.13 |
| 11.812 | 0.136 |
| 11.818 | 0.136 |
| 11.824 | 0.142 |
| 11.83 | 0.134 |
| 11.836 | 0.144 |
| 11.842 | 0.136 |
| 11.848 | 0.136 |
| 11.854 | 0.139 |
| 11.86 | 0.132 |
| 11.866 | 0.135 |
| 11.872 | 0.148 |
| 11.878 | 0.165 |
| 11.884 | 0.167 |
| 11.889 | 0.16 |
| 11.895 | 0.141 |
| 11.901 | 0.132 |
| 11.907 | 0.137 |
| 11.913 | 0.138 |
| 11.919 | 0.144 |
| 11.925 | 0.142 |
| 11.931 | 0.137 |
| 11.937 | 0.134 |
| 11.943 | 0.138 |
| 11.949 | 0.134 |
| 11.955 | 0.143 |
| 11.961 | 0.137 |
| 11.967 | 0.145 |
| 11.973 | 0.136 |
| 11.979 | 0.142 |
| 11.985 | 0.14 |
| 11.991 | 0.14 |
| 11.997 | 0.142 |
| 12.002 | 0.141 |
| 12.008 | 0.139 |
| 12.014 | 0.14 |
| 12.02 | 0.135 |
| 12.026 | 0.144 |
| 12.032 | 0.151 |
| 12.038 | 0.135 |
| 12.044 | 0.142 |
| 12.05 | 0.139 |
| 12.056 | 0.149 |
| 12.062 | 0.137 |
| 12.068 | 0.148 |
| 12.074 | 0.146 |
| 12.08 | 0.155 |
| 12.086 | 0.151 |
| 12.092 | 0.15 |
| 12.098 | 0.149 |
| 12.104 | 0.151 |
| 12.109 | 0.149 |
| 12.115 | 0.156 |
| 12.121 | 0.153 |
| 12.127 | 0.161 |
| 12.133 | 0.161 |
| 12.139 | 0.158 |
| 12.145 | 0.157 |
| 12.151 | 0.158 |
| 12.157 | 0.159 |
| 12.163 | 0.162 |
| 12.169 | 0.156 |
| 12.175 | 0.158 |
| 12.181 | 0.159 |
| 12.187 | 0.156 |
| 12.193 | 0.166 |
| 12.199 | 0.171 |
| 12.205 | 0.164 |
| 12.211 | 0.162 |
| 12.217 | 0.174 |
| 12.222 | 0.179 |
| 12.228 | 0.187 |
| 12.234 | 0.189 |
| 12.24 | 0.2 |
| 12.246 | 0.226 |
| 12.252 | 0.252 |
| 12.258 | 0.289 |
| 12.264 | 0.323 |
| 12.27 | 0.367 |
| 12.276 | 0.415 |
| 12.282 | 0.447 |
| 12.288 | 0.465 |
| 12.294 | 0.481 |
| 12.3 | 0.495 |
| 12.306 | 0.499 |
| 12.312 | 0.499 |
| 12.318 | 0.496 |
| 12.324 | 0.453 |
| 12.329 | 0.412 |
| 12.335 | 0.378 |
| 12.341 | 0.342 |
| 12.347 | 0.326 |
| 12.353 | 0.311 |
| 12.359 | 0.296 |
| 12.365 | 0.282 |
| 12.371 | 0.274 |
| 12.377 | 0.27 |
| 12.383 | 0.257 |
| 12.389 | 0.26 |
| 12.395 | 0.252 |
| 12.401 | 0.242 |
| 12.407 | 0.237 |
| 12.413 | 0.236 |
| 12.419 | 0.234 |
| 12.425 | 0.237 |
| 12.431 | 0.227 |
| 12.437 | 0.231 |
| 12.442 | 0.215 |
| 12.448 | 0.221 |
| 12.454 | 0.215 |
| 12.46 | 0.219 |
| 12.466 | 0.228 |
| 12.472 | 0.273 |
| 12.478 | 0.392 |
| 12.484 | 0.533 |
| 12.49 | 0.58 |
| 12.496 | 0.507 |
| 12.502 | 0.387 |
| 12.508 | 0.314 |
| 12.514 | 0.269 |
| 12.52 | 0.252 |
| 12.526 | 0.259 |
| 12.532 | 0.26 |
| 12.538 | 0.276 |
| 12.544 | 0.273 |
| 12.549 | 0.243 |
| 12.555 | 0.215 |
| 12.561 | 0.21 |
| 12.567 | 0.204 |
| 12.573 | 0.213 |
| 12.579 | 0.196 |
| 12.585 | 0.191 |
| 12.591 | 0.205 |
| 12.597 | 0.201 |
| 12.603 | 0.191 |
| 12.609 | 0.187 |
| 12.615 | 0.195 |
| 12.621 | 0.196 |
| 12.627 | 0.193 |
| 12.633 | 0.198 |
| 12.639 | 0.194 |
| 12.645 | 0.196 |
| 12.651 | 0.193 |
| 12.657 | 0.196 |
| 12.662 | 0.19 |
| 12.668 | 0.182 |
| 12.674 | 0.191 |
| 12.68 | 0.192 |
| 12.686 | 0.192 |
| 12.692 | 0.207 |
| 12.698 | 0.226 |
| 12.704 | 0.252 |
| 12.71 | 0.243 |
| 12.716 | 0.234 |
| 12.722 | 0.214 |
| 12.728 | 0.212 |
| 12.734 | 0.211 |
| 12.74 | 0.193 |
| 12.746 | 0.194 |
| 12.752 | 0.191 |
| 12.758 | 0.197 |
| 12.764 | 0.182 |
| 12.769 | 0.186 |
| 12.775 | 0.178 |
| 12.781 | 0.198 |
| 12.787 | 0.185 |
| 12.793 | 0.183 |
| 12.799 | 0.182 |
| 12.805 | 0.184 |
| 12.811 | 0.184 |
| 12.817 | 0.189 |
| 12.823 | 0.192 |
| 12.829 | 0.191 |
| 12.835 | 0.197 |
| 12.841 | 0.194 |
| 12.847 | 0.189 |
| 12.853 | 0.178 |
| 12.859 | 0.193 |
| 12.865 | 0.183 |
| 12.871 | 0.184 |
| 12.877 | 0.185 |
| 12.882 | 0.189 |
| 12.888 | 0.185 |
| 12.894 | 0.182 |
| 12.9 | 0.177 |
| 12.906 | 0.179 |
| 12.912 | 0.179 |
| 12.918 | 0.181 |
| 12.924 | 0.171 |
| 12.93 | 0.176 |
| 12.936 | 0.181 |
| 12.942 | 0.178 |
| 12.948 | 0.186 |
| 12.954 | 0.179 |
| 12.96 | 0.184 |
| 12.966 | 0.187 |
| 12.972 | 0.178 |
| 12.978 | 0.182 |
| 12.984 | 0.185 |
| 12.989 | 0.186 |
| 12.995 | 0.185 |
| 13.001 | 0.183 |
| 13.007 | 0.176 |
| 13.013 | 0.173 |
| 13.019 | 0.185 |
| 13.025 | 0.178 |
| 13.031 | 0.182 |
| 13.037 | 0.183 |
| 13.043 | 0.182 |
| 13.049 | 0.176 |
| 13.055 | 0.178 |
| 13.061 | 0.169 |
| 13.067 | 0.183 |
| 13.073 | 0.177 |
| 13.079 | 0.177 |
| 13.085 | 0.179 |
| 13.091 | 0.186 |
| 13.097 | 0.177 |
| 13.102 | 0.175 |
| 13.108 | 0.175 |
| 13.114 | 0.185 |
| 13.12 | 0.185 |
| 13.126 | 0.175 |
| 13.132 | 0.183 |
| 13.138 | 0.177 |
| 13.144 | 0.184 |
| 13.15 | 0.179 |
| 13.156 | 0.188 |
| 13.162 | 0.181 |
| 13.168 | 0.182 |
| 13.174 | 0.181 |
| 13.18 | 0.173 |
| 13.186 | 0.178 |
| 13.192 | 0.188 |
| 13.198 | 0.195 |
| 13.204 | 0.18 |
| 13.209 | 0.192 |
| 13.215 | 0.189 |
| 13.221 | 0.193 |
| 13.227 | 0.18 |
| 13.233 | 0.19 |
| 13.239 | 0.185 |
| 13.245 | 0.196 |
| 13.251 | 0.183 |
| 13.257 | 0.195 |
| 13.263 | 0.19 |
| 13.269 | 0.199 |
| 13.275 | 0.192 |
| 13.281 | 0.197 |
| 13.287 | 0.201 |
| 13.293 | 0.197 |
| 13.299 | 0.192 |
| 13.305 | 0.186 |
| 13.311 | 0.186 |
| 13.317 | 0.183 |
| 13.322 | 0.187 |
| 13.328 | 0.191 |
| 13.334 | 0.191 |
| 13.34 | 0.197 |
| 13.346 | 0.19 |
| 13.352 | 0.183 |
| 13.358 | 0.186 |
| 13.364 | 0.189 |
| 13.37 | 0.181 |
| 13.376 | 0.188 |
| 13.382 | 0.177 |
| 13.388 | 0.18 |
| 13.394 | 0.184 |
| 13.4 | 0.183 |
| 13.406 | 0.18 |
| 13.412 | 0.183 |
| 13.418 | 0.181 |
| 13.424 | 0.183 |
| 13.429 | 0.186 |
| 13.435 | 0.193 |
| 13.441 | 0.18 |
| 13.447 | 0.182 |
| 13.453 | 0.189 |
| 13.459 | 0.19 |
| 13.465 | 0.174 |
| 13.471 | 0.182 |
| 13.477 | 0.189 |
| 13.483 | 0.179 |
| 13.489 | 0.187 |
| 13.495 | 0.178 |
| 13.501 | 0.186 |
| 13.507 | 0.177 |
| 13.513 | 0.178 |
| 13.519 | 0.189 |
| 13.525 | 0.176 |
| 13.531 | 0.176 |
| 13.537 | 0.176 |
| 13.542 | 0.18 |
| 13.548 | 0.184 |
| 13.554 | 0.182 |
| 13.56 | 0.182 |
| 13.566 | 0.185 |
| 13.572 | 0.189 |
| 13.578 | 0.191 |
| 13.584 | 0.185 |
| 13.59 | 0.188 |
| 13.596 | 0.178 |
| 13.602 | 0.19 |
| 13.608 | 0.176 |
| 13.614 | 0.184 |
| 13.62 | 0.187 |
| 13.626 | 0.197 |
| 13.632 | 0.198 |
| 13.638 | 0.19 |
| 13.644 | 0.191 |
| 13.649 | 0.18 |
| 13.655 | 0.185 |
| 13.661 | 0.181 |
| 13.667 | 0.184 |
| 13.673 | 0.182 |
| 13.679 | 0.183 |
| 13.685 | 0.182 |
| 13.691 | 0.173 |
| 13.697 | 0.188 |
| 13.703 | 0.22 |
| 13.709 | 0.268 |
| 13.715 | 0.377 |
| 13.721 | 0.468 |
| 13.727 | 0.532 |
| 13.733 | 0.498 |
| 13.739 | 0.425 |
| 13.745 | 0.341 |
| 13.751 | 0.298 |
| 13.757 | 0.252 |
| 13.762 | 0.245 |
| 13.768 | 0.24 |
| 13.774 | 0.217 |
| 13.78 | 0.215 |
| 13.786 | 0.218 |
| 13.792 | 0.211 |
| 13.798 | 0.205 |
| 13.804 | 0.213 |
| 13.81 | 0.198 |
| 13.816 | 0.209 |
| 13.822 | 0.204 |
| 13.828 | 0.209 |
| 13.834 | 0.199 |
| 13.84 | 0.2 |
| 13.846 | 0.196 |
| 13.852 | 0.195 |
| 13.858 | 0.196 |
| 13.864 | 0.188 |
| 13.869 | 0.2 |
| 13.875 | 0.193 |
| 13.881 | 0.194 |
| 13.887 | 0.186 |
| 13.893 | 0.184 |
| 13.899 | 0.181 |
| 13.905 | 0.187 |
| 13.911 | 0.18 |
| 13.917 | 0.182 |
| 13.923 | 0.184 |
| 13.929 | 0.184 |
| 13.935 | 0.189 |
| 13.941 | 0.188 |
| 13.947 | 0.181 |
| 13.953 | 0.19 |
| 13.959 | 0.186 |
| 13.965 | 0.19 |
| 13.971 | 0.187 |
| 13.977 | 0.191 |
| 13.982 | 0.181 |
| 13.988 | 0.189 |
| 13.994 | 0.198 |
| 14.0 | 0.2 |
| 14.006 | 0.255 |
| 14.012 | 0.278 |
| 14.018 | 0.299 |
| 14.024 | 0.306 |
| 14.03 | 0.294 |
| 14.036 | 0.275 |
| 14.042 | 0.237 |
| 14.048 | 0.225 |
| 14.054 | 0.216 |
| 14.06 | 0.224 |
| 14.066 | 0.203 |
| 14.072 | 0.201 |
| 14.078 | 0.194 |
| 14.084 | 0.2 |
| 14.089 | 0.204 |
| 14.095 | 0.208 |
| 14.101 | 0.203 |
| 14.107 | 0.193 |
| 14.113 | 0.19 |
| 14.119 | 0.195 |
| 14.125 | 0.185 |
| 14.131 | 0.195 |
| 14.137 | 0.196 |
| 14.143 | 0.186 |
| 14.149 | 0.181 |
| 14.155 | 0.193 |
| 14.161 | 0.191 |
| 14.167 | 0.184 |
| 14.173 | 0.189 |
| 14.179 | 0.189 |
| 14.185 | 0.186 |
| 14.191 | 0.179 |
| 14.197 | 0.181 |
| 14.202 | 0.189 |
| 14.208 | 0.188 |
| 14.214 | 0.195 |
| 14.22 | 0.184 |
| 14.226 | 0.179 |
| 14.232 | 0.187 |
| 14.238 | 0.176 |
| 14.244 | 0.184 |
| 14.25 | 0.189 |
| 14.256 | 0.181 |
| 14.262 | 0.177 |
| 14.268 | 0.185 |
| 14.274 | 0.184 |
| 14.28 | 0.185 |
| 14.286 | 0.186 |
| 14.292 | 0.186 |
| 14.298 | 0.18 |
| 14.304 | 0.19 |
| 14.309 | 0.18 |
| 14.315 | 0.184 |
| 14.321 | 0.192 |
| 14.327 | 0.185 |
| 14.333 | 0.181 |
| 14.339 | 0.18 |
| 14.345 | 0.18 |
| 14.351 | 0.175 |
| 14.357 | 0.183 |
| 14.363 | 0.184 |
| 14.369 | 0.179 |
| 14.375 | 0.184 |
| 14.381 | 0.184 |
| 14.387 | 0.182 |
| 14.393 | 0.179 |
| 14.399 | 0.185 |
| 14.405 | 0.191 |
| 14.411 | 0.178 |
| 14.417 | 0.189 |
| 14.422 | 0.178 |
| 14.428 | 0.192 |
| 14.434 | 0.188 |
| 14.44 | 0.195 |
| 14.446 | 0.185 |
| 14.452 | 0.189 |
| 14.458 | 0.196 |
| 14.464 | 0.189 |
| 14.47 | 0.202 |
| 14.476 | 0.2 |
| 14.482 | 0.195 |
| 14.488 | 0.203 |
| 14.494 | 0.202 |
| 14.5 | 0.216 |
| 14.506 | 0.204 |
| 14.512 | 0.201 |
| 14.518 | 0.199 |
| 14.524 | 0.199 |
| 14.529 | 0.202 |
| 14.535 | 0.194 |
| 14.541 | 0.201 |
| 14.547 | 0.19 |
| 14.553 | 0.186 |
| 14.559 | 0.191 |
| 14.565 | 0.193 |
| 14.571 | 0.19 |
| 14.577 | 0.192 |
| 14.583 | 0.185 |
| 14.589 | 0.183 |
| 14.595 | 0.184 |
| 14.601 | 0.186 |
| 14.607 | 0.179 |
| 14.613 | 0.178 |
| 14.619 | 0.183 |
| 14.625 | 0.18 |
| 14.631 | 0.184 |
| 14.637 | 0.18 |
| 14.642 | 0.186 |
| 14.648 | 0.186 |
| 14.654 | 0.19 |
| 14.66 | 0.177 |
| 14.666 | 0.171 |
| 14.672 | 0.181 |
| 14.678 | 0.183 |
| 14.684 | 0.184 |
| 14.69 | 0.178 |
| 14.696 | 0.183 |
| 14.702 | 0.196 |
| 14.708 | 0.176 |
| 14.714 | 0.183 |
| 14.72 | 0.191 |
| 14.726 | 0.187 |
| 14.732 | 0.174 |
| 14.738 | 0.183 |
| 14.744 | 0.185 |
| 14.749 | 0.185 |
| 14.755 | 0.182 |
| 14.761 | 0.186 |
| 14.767 | 0.181 |
| 14.773 | 0.179 |
| 14.779 | 0.176 |
| 14.785 | 0.192 |
| 14.791 | 0.175 |
| 14.797 | 0.186 |
| 14.803 | 0.188 |
| 14.809 | 0.18 |
| 14.815 | 0.187 |
| 14.821 | 0.182 |
| 14.827 | 0.174 |
| 14.833 | 0.193 |
| 14.839 | 0.185 |
| 14.845 | 0.197 |
| 14.851 | 0.188 |
| 14.857 | 0.182 |
| 14.862 | 0.187 |
| 14.868 | 0.177 |
| 14.874 | 0.188 |
| 14.88 | 0.187 |
| 14.886 | 0.182 |
| 14.892 | 0.171 |
| 14.898 | 0.179 |
| 14.904 | 0.183 |
| 14.91 | 0.188 |
| 14.916 | 0.178 |
| 14.922 | 0.184 |
| 14.928 | 0.183 |
| 14.934 | 0.187 |
| 14.94 | 0.186 |
| 14.946 | 0.186 |
| 14.952 | 0.183 |
| 14.958 | 0.185 |
| 14.964 | 0.181 |
| 14.969 | 0.183 |
| 14.975 | 0.181 |
| 14.981 | 0.189 |
| 14.987 | 0.194 |
| 14.993 | 0.18 |
| 14.999 | 0.189 |
| 15.005 | 0.185 |
| 15.011 | 0.178 |
| 15.017 | 0.189 |
| 15.023 | 0.187 |
| 15.029 | 0.182 |
| 15.035 | 0.183 |
| 15.041 | 0.184 |
| 15.047 | 0.183 |
| 15.053 | 0.185 |
| 15.059 | 0.182 |
| 15.065 | 0.188 |
| 15.071 | 0.187 |
| 15.077 | 0.187 |
| 15.082 | 0.185 |
| 15.088 | 0.184 |
| 15.094 | 0.186 |
| 15.1 | 0.191 |
| 15.106 | 0.183 |
| 15.112 | 0.189 |
| 15.118 | 0.189 |
| 15.124 | 0.187 |
| 15.13 | 0.187 |
| 15.136 | 0.178 |
| 15.142 | 0.171 |
| 15.148 | 0.185 |
| 15.154 | 0.188 |
| 15.16 | 0.182 |
| 15.166 | 0.185 |
| 15.172 | 0.187 |
| 15.178 | 0.194 |
| 15.184 | 0.181 |
| 15.189 | 0.189 |
| 15.195 | 0.181 |
| 15.201 | 0.191 |
| 15.207 | 0.187 |
| 15.213 | 0.187 |
| 15.219 | 0.179 |
| 15.225 | 0.188 |
| 15.231 | 0.187 |
| 15.237 | 0.192 |
| 15.243 | 0.187 |
| 15.249 | 0.178 |
| 15.255 | 0.176 |
| 15.261 | 0.185 |
| 15.267 | 0.186 |
| 15.273 | 0.179 |
| 15.279 | 0.175 |
| 15.285 | 0.189 |
| 15.291 | 0.182 |
| 15.297 | 0.18 |
| 15.302 | 0.181 |
| 15.308 | 0.187 |
| 15.314 | 0.178 |
| 15.32 | 0.191 |
| 15.326 | 0.177 |
| 15.332 | 0.192 |
| 15.338 | 0.189 |
| 15.344 | 0.186 |
| 15.35 | 0.186 |
| 15.356 | 0.186 |
| 15.362 | 0.192 |
| 15.368 | 0.179 |
| 15.374 | 0.189 |
| 15.38 | 0.173 |
| 15.386 | 0.188 |
| 15.392 | 0.187 |
| 15.398 | 0.182 |
| 15.404 | 0.192 |
| 15.41 | 0.19 |
| 15.415 | 0.2 |
| 15.421 | 0.217 |
| 15.427 | 0.284 |
| 15.433 | 0.367 |
| 15.439 | 0.508 |
| 15.445 | 0.701 |
| 15.451 | 0.896 |
| 15.457 | 0.986 |
| 15.463 | 0.971 |
| 15.469 | 0.89 |
| 15.475 | 0.756 |
| 15.481 | 0.617 |
| 15.487 | 0.511 |
| 15.493 | 0.438 |
| 15.499 | 0.382 |
| 15.505 | 0.36 |
| 15.511 | 0.316 |
| 15.517 | 0.301 |
| 15.522 | 0.293 |
| 15.528 | 0.282 |
| 15.534 | 0.28 |
| 15.54 | 0.271 |
| 15.546 | 0.249 |
| 15.552 | 0.261 |
| 15.558 | 0.246 |
| 15.564 | 0.25 |
| 15.57 | 0.247 |
| 15.576 | 0.243 |
| 15.582 | 0.228 |
| 15.588 | 0.233 |
| 15.594 | 0.237 |
| 15.6 | 0.231 |
| 15.606 | 0.231 |
| 15.612 | 0.215 |
| 15.618 | 0.223 |
| 15.624 | 0.231 |
| 15.63 | 0.226 |
| 15.635 | 0.223 |
| 15.641 | 0.227 |
| 15.647 | 0.223 |
| 15.653 | 0.214 |
| 15.659 | 0.22 |
| 15.665 | 0.216 |
| 15.671 | 0.208 |
| 15.677 | 0.222 |
| 15.683 | 0.212 |
| 15.689 | 0.208 |
| 15.695 | 0.209 |
| 15.701 | 0.207 |
| 15.707 | 0.207 |
| 15.713 | 0.216 |
| 15.719 | 0.205 |
| 15.725 | 0.214 |
| 15.731 | 0.212 |
| 15.737 | 0.193 |
| 15.742 | 0.21 |
| 15.748 | 0.209 |
| 15.754 | 0.203 |
| 15.76 | 0.206 |
| 15.766 | 0.203 |
| 15.772 | 0.206 |
| 15.778 | 0.203 |
| 15.784 | 0.213 |
| 15.79 | 0.203 |
| 15.796 | 0.21 |
| 15.802 | 0.208 |
| 15.808 | 0.205 |
| 15.814 | 0.213 |
| 15.82 | 0.223 |
| 15.826 | 0.24 |
| 15.832 | 0.261 |
| 15.838 | 0.318 |
| 15.844 | 0.399 |
| 15.85 | 0.569 |
| 15.855 | 0.758 |
| 15.861 | 0.952 |
| 15.867 | 1.12 |
| 15.873 | 1.141 |
| 15.879 | 1.08 |
| 15.885 | 0.964 |
| 15.891 | 0.801 |
| 15.897 | 0.667 |
| 15.903 | 0.554 |
| 15.909 | 0.468 |
| 15.915 | 0.415 |
| 15.921 | 0.39 |
| 15.927 | 0.356 |
| 15.933 | 0.334 |
| 15.939 | 0.312 |
| 15.945 | 0.304 |
| 15.951 | 0.304 |
| 15.957 | 0.296 |
| 15.962 | 0.284 |
| 15.968 | 0.284 |
| 15.974 | 0.291 |
| 15.98 | 0.289 |
| 15.986 | 0.28 |
| 15.992 | 0.278 |
| 15.998 | 0.28 |
| 16.004 | 0.274 |
| 16.01 | 0.265 |
| 16.016 | 0.271 |
| 16.022 | 0.256 |
| 16.028 | 0.251 |
| 16.034 | 0.254 |
| 16.04 | 0.243 |
| 16.046 | 0.241 |
| 16.052 | 0.245 |
| 16.058 | 0.244 |
| 16.064 | 0.243 |
| 16.07 | 0.232 |
| 16.075 | 0.232 |
| 16.081 | 0.228 |
| 16.087 | 0.225 |
| 16.093 | 0.226 |
| 16.099 | 0.235 |
| 16.105 | 0.226 |
| 16.111 | 0.214 |
| 16.117 | 0.229 |
| 16.123 | 0.222 |
| 16.129 | 0.218 |
| 16.135 | 0.218 |
| 16.141 | 0.216 |
| 16.147 | 0.221 |
| 16.153 | 0.226 |
| 16.159 | 0.217 |
| 16.165 | 0.221 |
| 16.171 | 0.21 |
| 16.177 | 0.202 |
| 16.182 | 0.218 |
| 16.188 | 0.219 |
| 16.194 | 0.21 |
| 16.2 | 0.211 |
| 16.206 | 0.209 |
| 16.212 | 0.214 |
| 16.218 | 0.21 |
| 16.224 | 0.217 |
| 16.23 | 0.199 |
| 16.236 | 0.214 |
| 16.242 | 0.215 |
| 16.248 | 0.21 |
| 16.254 | 0.21 |
| 16.26 | 0.212 |
| 16.266 | 0.213 |
| 16.272 | 0.21 |
| 16.278 | 0.216 |
| 16.284 | 0.217 |
| 16.29 | 0.208 |
| 16.295 | 0.212 |
| 16.301 | 0.203 |
| 16.307 | 0.203 |
| 16.313 | 0.2 |
| 16.319 | 0.206 |
| 16.325 | 0.208 |
| 16.331 | 0.203 |
| 16.337 | 0.196 |
| 16.343 | 0.2 |
| 16.349 | 0.196 |
| 16.355 | 0.206 |
| 16.361 | 0.194 |
| 16.367 | 0.205 |
| 16.373 | 0.197 |
| 16.379 | 0.2 |
| 16.385 | 0.2 |
| 16.391 | 0.206 |
| 16.397 | 0.195 |
| 16.402 | 0.199 |
| 16.408 | 0.202 |
| 16.414 | 0.205 |
| 16.42 | 0.204 |
| 16.426 | 0.184 |
| 16.432 | 0.191 |
| 16.438 | 0.198 |
| 16.444 | 0.198 |
| 16.45 | 0.203 |
| 16.456 | 0.194 |
| 16.462 | 0.196 |
| 16.468 | 0.2 |
| 16.474 | 0.194 |
| 16.48 | 0.201 |
| 16.486 | 0.198 |
| 16.492 | 0.204 |